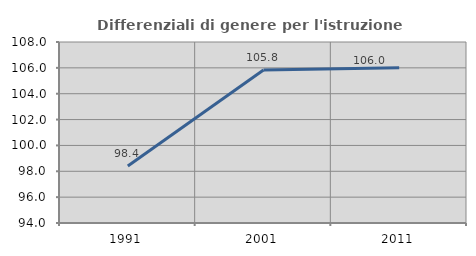
| Category | Differenziali di genere per l'istruzione superiore |
|---|---|
| 1991.0 | 98.411 |
| 2001.0 | 105.831 |
| 2011.0 | 106.004 |